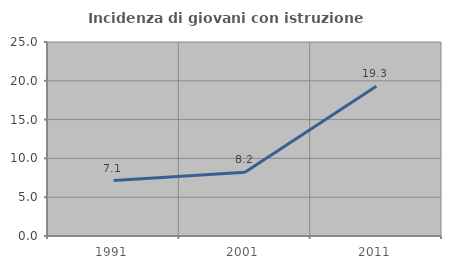
| Category | Incidenza di giovani con istruzione universitaria |
|---|---|
| 1991.0 | 7.143 |
| 2001.0 | 8.205 |
| 2011.0 | 19.304 |